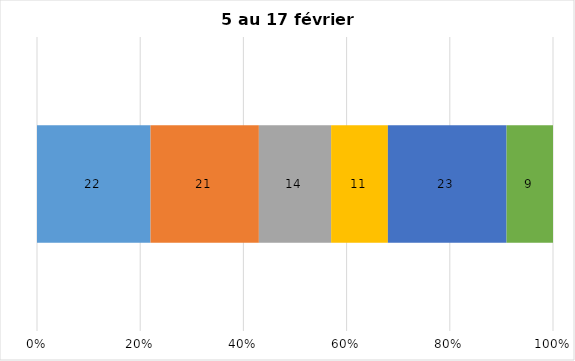
| Category | Plusieurs fois par jour | Une fois par jour | Quelques fois par semaine   | Une fois par semaine ou moins   |  Jamais   |  Je n’utilise pas les médias sociaux |
|---|---|---|---|---|---|---|
| 0 | 22 | 21 | 14 | 11 | 23 | 9 |